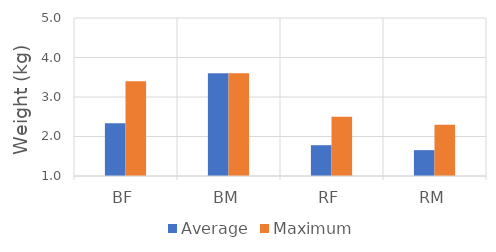
| Category | Average | Maximum |
|---|---|---|
| BF | 2.333 | 3.4 |
| BM | 3.6 | 3.6 |
| RF | 1.78 | 2.5 |
| RM | 1.654 | 2.3 |